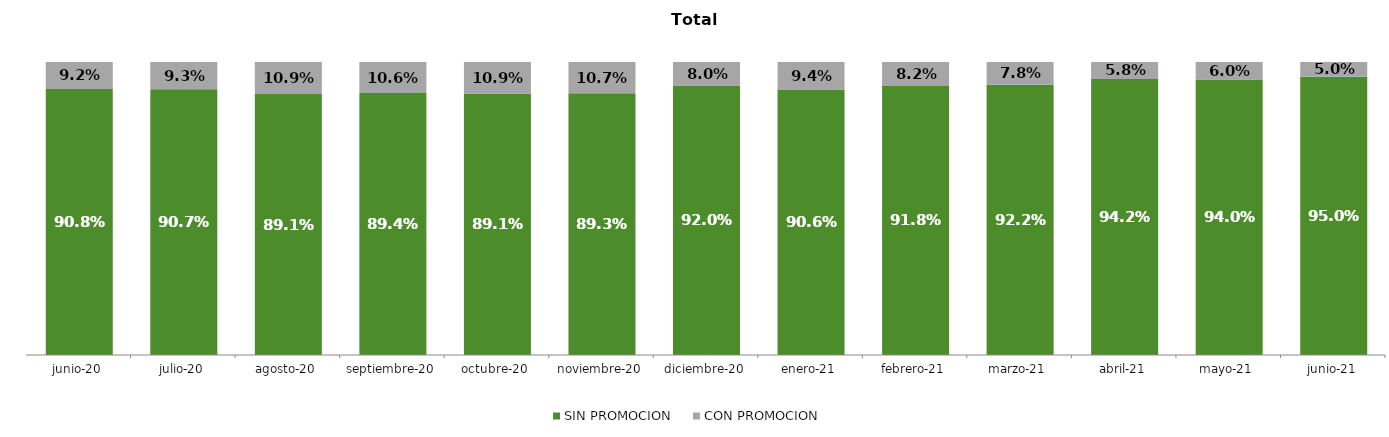
| Category | SIN PROMOCION   | CON PROMOCION   |
|---|---|---|
| 2020-06-01 | 0.908 | 0.092 |
| 2020-07-01 | 0.907 | 0.093 |
| 2020-08-01 | 0.891 | 0.109 |
| 2020-09-01 | 0.894 | 0.106 |
| 2020-10-01 | 0.891 | 0.109 |
| 2020-11-01 | 0.893 | 0.107 |
| 2020-12-01 | 0.92 | 0.08 |
| 2021-01-01 | 0.906 | 0.094 |
| 2021-02-01 | 0.918 | 0.082 |
| 2021-03-01 | 0.922 | 0.078 |
| 2021-04-01 | 0.942 | 0.058 |
| 2021-05-01 | 0.94 | 0.06 |
| 2021-06-01 | 0.95 | 0.05 |